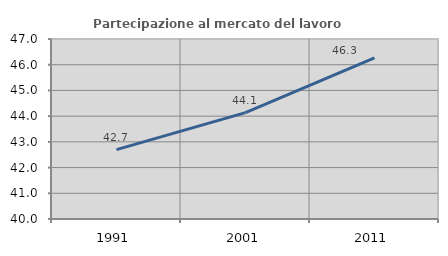
| Category | Partecipazione al mercato del lavoro  femminile |
|---|---|
| 1991.0 | 42.697 |
| 2001.0 | 44.138 |
| 2011.0 | 46.269 |